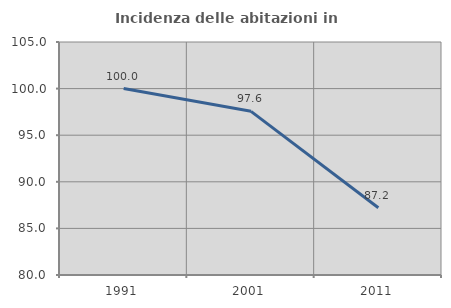
| Category | Incidenza delle abitazioni in proprietà  |
|---|---|
| 1991.0 | 100 |
| 2001.0 | 97.561 |
| 2011.0 | 87.209 |